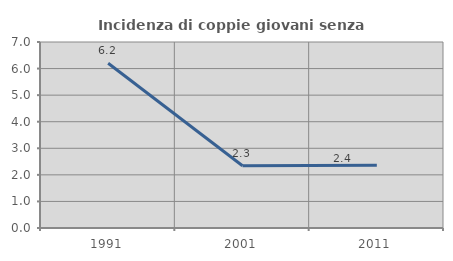
| Category | Incidenza di coppie giovani senza figli |
|---|---|
| 1991.0 | 6.202 |
| 2001.0 | 2.344 |
| 2011.0 | 2.362 |